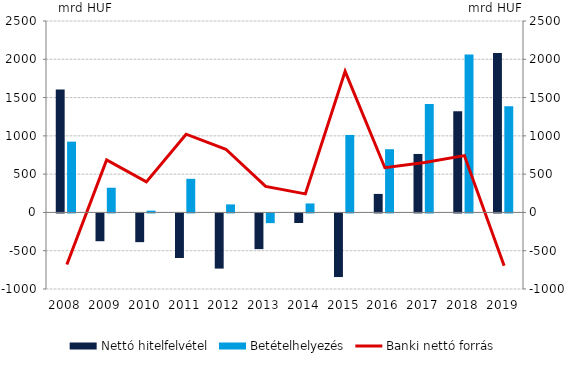
| Category | Nettó hitelfelvétel | Betételhelyezés |
|---|---|---|
| 2008.0 | 1604.117 | 924.526 |
| 2009.0 | -363.024 | 322.449 |
| 2010.0 | -375.15 | 23.517 |
| 2011.0 | -582.414 | 439.017 |
| 2012.0 | -720.502 | 104.961 |
| 2013.0 | -466.305 | -126.817 |
| 2014.0 | -125.073 | 117.279 |
| 2015.0 | -830.803 | 1012.037 |
| 2016.0 | 241.811 | 825.492 |
| 2017.0 | 763.636 | 1415.416 |
| 2018.0 | 1320.258 | 2062.239 |
| 2019.0 | 2080.908 | 1385.68 |